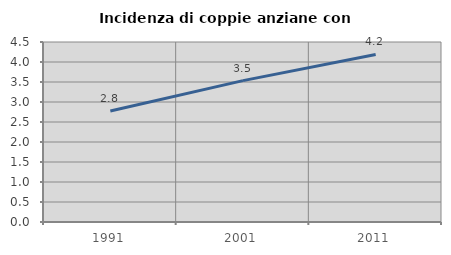
| Category | Incidenza di coppie anziane con figli |
|---|---|
| 1991.0 | 2.776 |
| 2001.0 | 3.535 |
| 2011.0 | 4.189 |